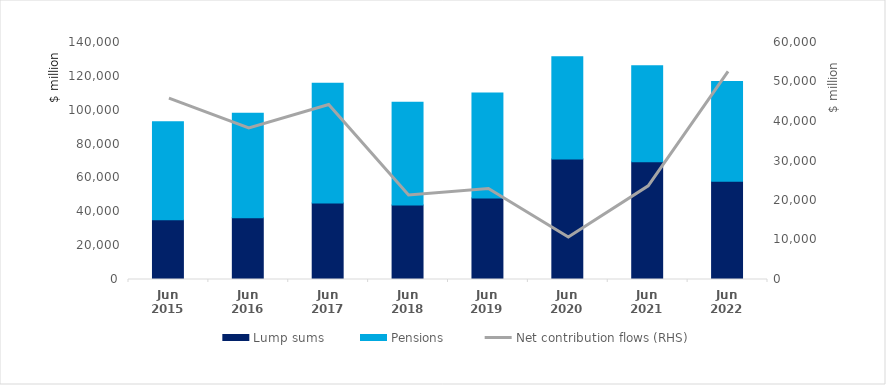
| Category | Lump sums | Pensions  |
|---|---|---|
| 0 | 35345 | 57814 |
| 1 | 36435 | 61788 |
| 2 | 45189 | 70714 |
| 3 | 43936 | 60789 |
| 4 | 48214 | 61905 |
| 5 | 71247 | 60343 |
| 6 | 69598 | 56624 |
| 7 | 58077 | 58821 |